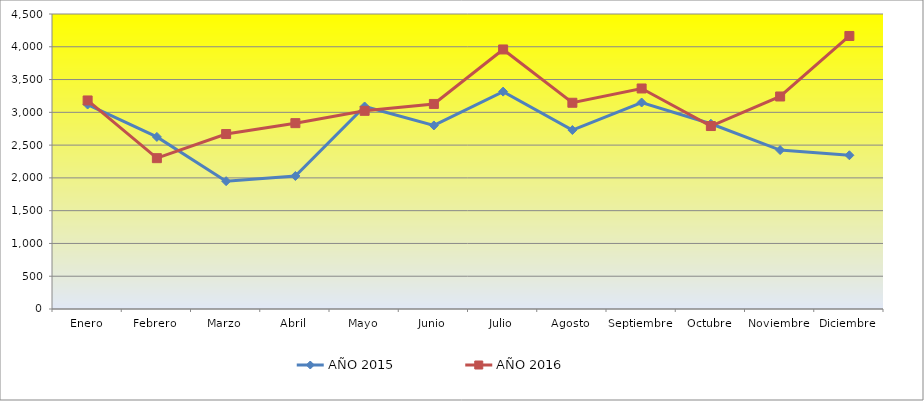
| Category | AÑO 2015 | AÑO 2016 |
|---|---|---|
| Enero | 3119 | 3181 |
| Febrero | 2625 | 2301 |
| Marzo | 1950 | 2669 |
| Abril | 2029 | 2835 |
| Mayo | 3089 | 3023 |
| Junio | 2800 | 3128 |
| Julio | 3316 | 3959 |
| Agosto | 2730 | 3146 |
| Septiembre | 3150 | 3364 |
| Octubre | 2826 | 2791 |
| Noviembre | 2424 | 3242 |
| Diciembre | 2345 | 4165 |